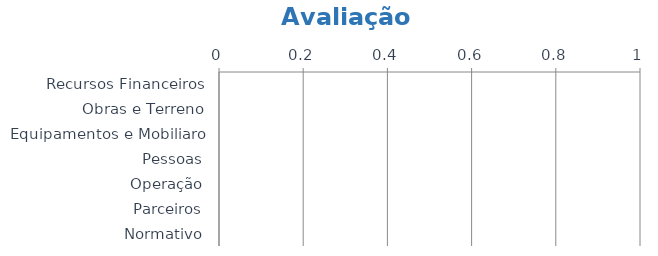
| Category | Series 0 |
|---|---|
| Recursos Financeiros | 0 |
| Obras e Terreno | 0 |
| Equipamentos e Mobiliaro | 0 |
| Pessoas | 0 |
| Operação | 0 |
| Parceiros | 0 |
| Normativo | 0 |